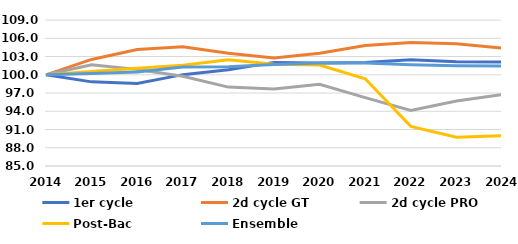
| Category | 1er cycle | 2d cycle GT | 2d cycle PRO | Post-Bac | Ensemble |
|---|---|---|---|---|---|
| 2014 | 100 | 100 | 100 | 100 | 100 |
| 2015 | 98.837 | 102.525 | 101.646 | 100.54 | 100.223 |
| 2016 | 98.58 | 104.148 | 100.878 | 101.093 | 100.444 |
| 2017 | 100.026 | 104.612 | 99.77 | 101.585 | 101.284 |
| 2018 | 100.84 | 103.555 | 97.975 | 102.462 | 101.306 |
| 2019 | 102.041 | 102.777 | 97.673 | 101.729 | 101.71 |
| 2020 | 101.946 | 103.553 | 98.425 | 101.597 | 101.94 |
| 2021 | 102.013 | 104.826 | 96.252 | 99.352 | 101.94 |
| 2022 | 102.461 | 105.322 | 94.151 | 91.522 | 101.664 |
| 2023 | 102.129 | 105.113 | 95.692 | 89.732 | 101.505 |
| 2024 | 102.101 | 104.403 | 96.741 | 89.996 | 101.439 |